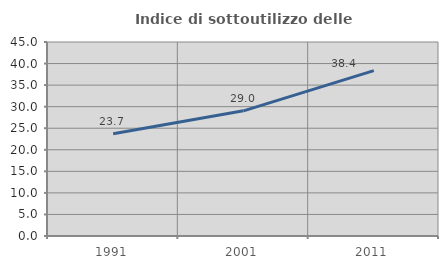
| Category | Indice di sottoutilizzo delle abitazioni  |
|---|---|
| 1991.0 | 23.723 |
| 2001.0 | 29.038 |
| 2011.0 | 38.353 |